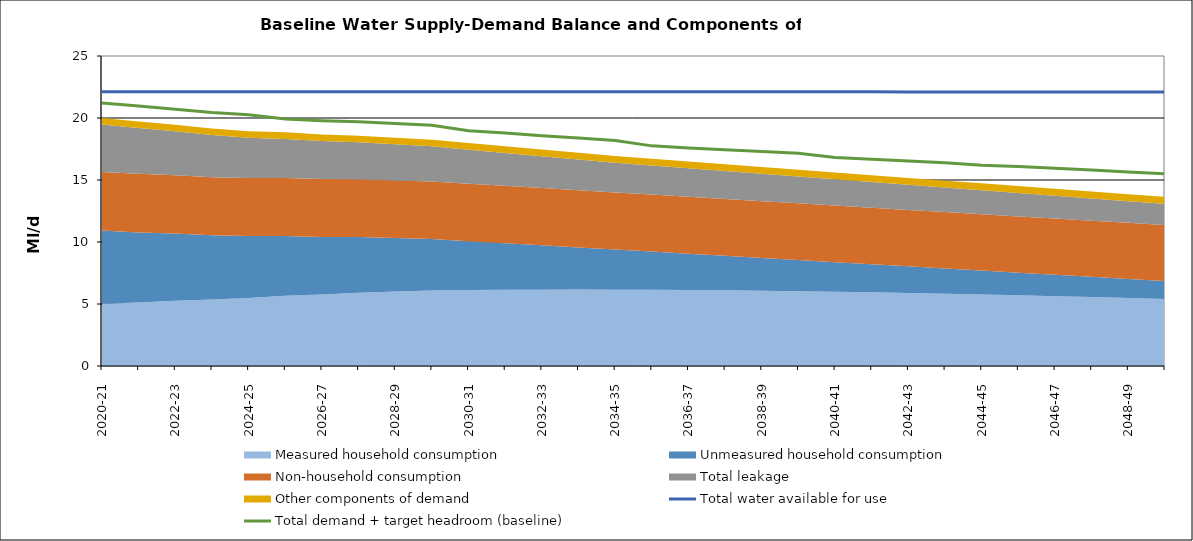
| Category | Total water available for use | Total demand + target headroom (baseline) |
|---|---|---|
| 2020-21 | 22.124 | 21.213 |
| 2021-22 | 22.123 | 20.966 |
| 2022-23 | 22.122 | 20.713 |
| 2023-24 | 22.12 | 20.441 |
| 2024-25 | 22.119 | 20.263 |
| 2025-26 | 22.118 | 19.927 |
| 2026-27 | 22.116 | 19.779 |
| 2027-28 | 22.115 | 19.693 |
| 2028-29 | 22.113 | 19.554 |
| 2029-30 | 22.112 | 19.415 |
| 2030-31 | 22.111 | 18.98 |
| 2031-32 | 22.111 | 18.788 |
| 2032-33 | 22.11 | 18.577 |
| 2033-34 | 22.11 | 18.389 |
| 2034-35 | 22.11 | 18.191 |
| 2035-36 | 22.109 | 17.753 |
| 2036-37 | 22.109 | 17.583 |
| 2037-38 | 22.108 | 17.431 |
| 2038-39 | 22.108 | 17.29 |
| 2039-40 | 22.108 | 17.149 |
| 2040-41 | 22.107 | 16.814 |
| 2041-42 | 22.107 | 16.675 |
| 2042-43 | 22.107 | 16.525 |
| 2043-44 | 22.106 | 16.385 |
| 2044-45 | 22.106 | 16.183 |
| 2045-46 | 22.106 | 16.085 |
| 2046-47 | 22.105 | 15.948 |
| 2047-48 | 22.105 | 15.802 |
| 2048-49 | 22.105 | 15.654 |
| 2049-50 | 22.104 | 15.507 |